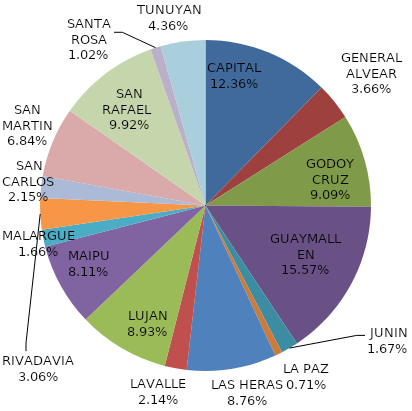
| Category | Total Quiniela Recaudación  |
|---|---|
| CAPITAL | 13881855 |
| GENERAL ALVEAR | 4114494 |
| GODOY CRUZ | 10202919 |
| GUAYMALLEN | 17479293 |
| JUNIN | 1879149 |
| LA PAZ | 796656 |
| LAS HERAS | 9829851 |
| LAVALLE | 2400957 |
| LUJAN | 10029247 |
| MAIPU | 9105767 |
| MALARGUE | 1861441 |
| RIVADAVIA | 3430196 |
| SAN CARLOS | 2408226 |
| SAN MARTIN | 7681349 |
| SAN RAFAEL  | 11132514 |
| SANTA ROSA | 1148063 |
| TUNUYAN | 4899452 |